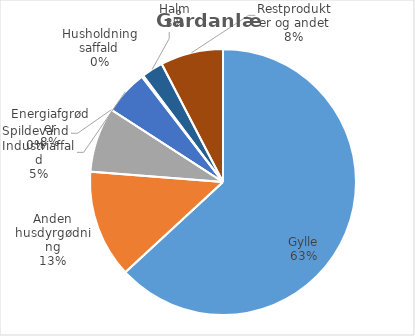
| Category | Series 0 |
|---|---|
| Gylle | 1795827.28 |
| Anden husdyrgødning | 372818.55 |
| Energiafgrøder | 224752.14 |
| Spildevand | 0 |
| Industriaffald | 154076.94 |
| Husholdningsaffald | 5378 |
| Halm | 74826.2 |
| Restprodukter og andet | 216910.81 |